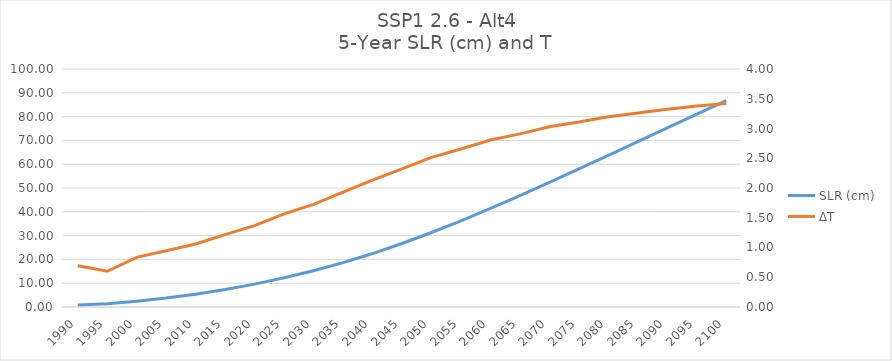
| Category | SLR (cm) |
|---|---|
| 1990.0 | 0.87 |
| 1995.0 | 1.399 |
| 2000.0 | 2.407 |
| 2005.0 | 3.755 |
| 2010.0 | 5.386 |
| 2015.0 | 7.344 |
| 2020.0 | 9.606 |
| 2025.0 | 12.264 |
| 2030.0 | 15.241 |
| 2035.0 | 18.638 |
| 2040.0 | 22.457 |
| 2045.0 | 26.678 |
| 2050.0 | 31.31 |
| 2055.0 | 36.219 |
| 2060.0 | 41.422 |
| 2065.0 | 46.787 |
| 2070.0 | 52.355 |
| 2075.0 | 57.995 |
| 2080.0 | 63.736 |
| 2085.0 | 69.494 |
| 2090.0 | 75.253 |
| 2095.0 | 81.004 |
| 2100.0 | 86.701 |